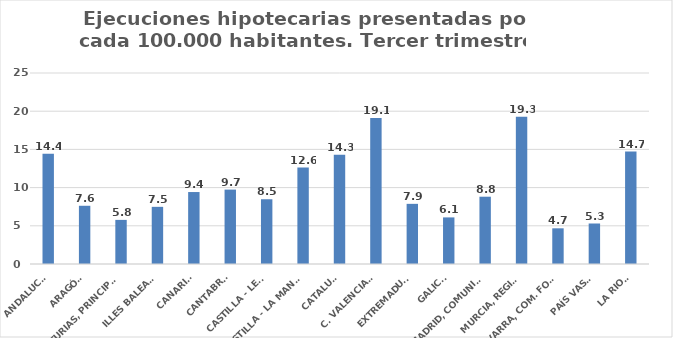
| Category | Series 0 |
|---|---|
| ANDALUCÍA | 14.431 |
| ARAGÓN | 7.621 |
| ASTURIAS, PRINCIPADO | 5.774 |
| ILLES BALEARS | 7.481 |
| CANARIAS | 9.419 |
| CANTABRIA | 9.74 |
| CASTILLA - LEÓN | 8.481 |
| CASTILLA - LA MANCHA | 12.621 |
| CATALUÑA | 14.313 |
| C. VALENCIANA | 19.113 |
| EXTREMADURA | 7.873 |
| GALICIA | 6.099 |
| MADRID, COMUNIDAD | 8.807 |
| MURCIA, REGIÓN | 19.263 |
| NAVARRA, COM. FORAL | 4.671 |
| PAÍS VASCO | 5.301 |
| LA RIOJA | 14.711 |